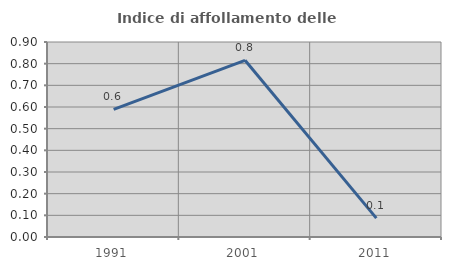
| Category | Indice di affollamento delle abitazioni  |
|---|---|
| 1991.0 | 0.589 |
| 2001.0 | 0.815 |
| 2011.0 | 0.087 |